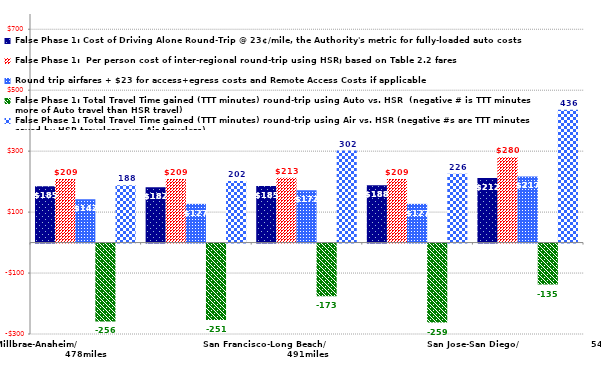
| Category | False Phase 1: Cost of Driving Alone Round-Trip @ 23¢/mile, the Authority's metric for fully-loaded auto costs | False Phase 1:  Per person cost of inter-regional round-trip using HSR; based on Table 2.2 fares | Round trip airfares + $23 for access+egress costs and Remote Access Costs if applicable | False Phase 1: Total Travel Time gained (TTT minutes) round-trip using Auto vs. HSR  (negative # is TTT minutes more of Auto travel than HSR travel) | False Phase 1: Total Travel Time gained (TTT minutes) round-trip using Air vs. HSR (negative #s are TTT minutes saved by HSR travelers over Air travelers) |
|---|---|---|---|---|---|
| Millbrae-Anaheim/                                    478miles | 184.92 | 209 | 142 | -255.6 | 188 |
| San Francisco-OC Gateway/              480miles | 181.7 | 209 | 127 | -250.8 | 202 |
| San Francisco-Long Beach/                                491miles | 185.38 | 212.5 | 172 | -173.2 | 302 |
| San Francisco-Anaheim/                                               493miles | 188.14 | 209 | 127 | -259 | 226 |
| San Jose-San Diego/                        546miles | 211.6 | 280.3 | 217 | -134.6 | 436 |